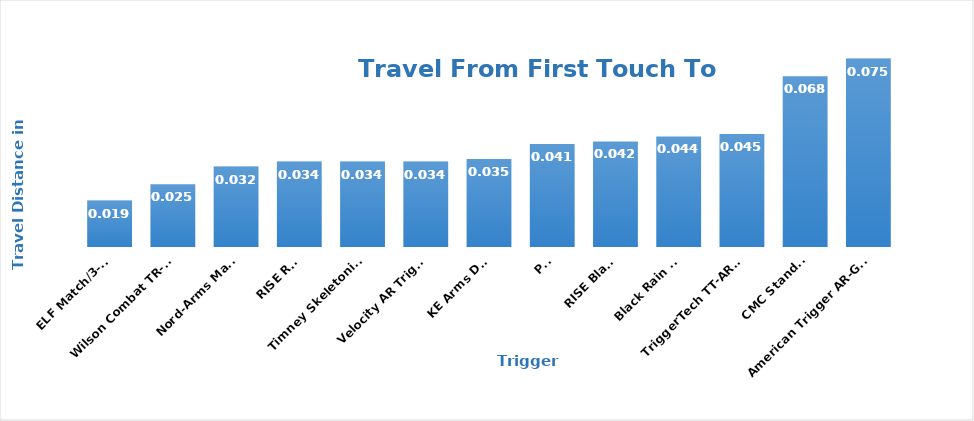
| Category | Travel to Break |
|---|---|
| ELF Match/3-Gun | 0.018 |
| Wilson Combat TR-TTU | 0.025 |
| Nord-Arms Match | 0.032 |
| RISE Red | 0.034 |
| Timney Skeletonized | 0.034 |
| Velocity AR Trigger | 0.034 |
| KE Arms DMR | 0.035 |
| POF | 0.041 |
| RISE Black | 0.042 |
| Black Rain DIT | 0.044 |
| TriggerTech TT-AR-15 | 0.045 |
| CMC Standard | 0.068 |
| American Trigger AR-GOLD | 0.075 |